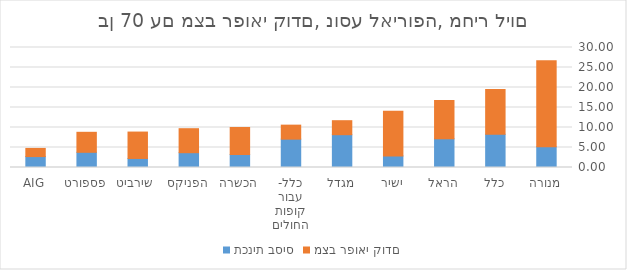
| Category | תכנית בסיס | מצב רפואי קודם |
|---|---|---|
| מנורה | 5.163 | 21.503 |
| כלל | 8.29 | 11.2 |
| הראל | 7.18 | 9.57 |
| ישיר | 2.9 | 11.15 |
| מגדל | 8.2 | 3.5 |
| כלל- עבור קופות החולים | 7.09 | 3.5 |
| הכשרה | 3.25 | 6.75 |
| הפניקס | 3.7 | 6 |
| שירביט  | 2.26 | 6.6 |
| פספורט | 3.8 | 5 |
| AIG | 2.73 | 2.04 |